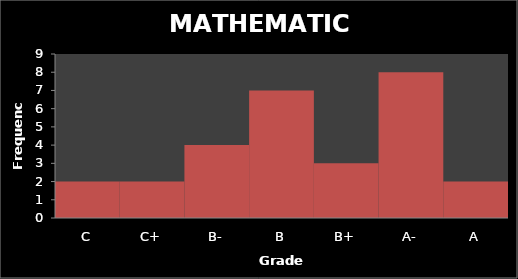
| Category | Series 0 |
|---|---|
| C | 2 |
| C+ | 2 |
| B- | 4 |
| B | 7 |
| B+ | 3 |
| A- | 8 |
| A | 2 |